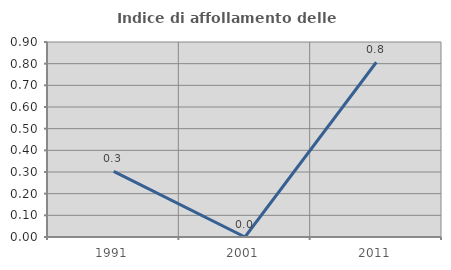
| Category | Indice di affollamento delle abitazioni  |
|---|---|
| 1991.0 | 0.303 |
| 2001.0 | 0 |
| 2011.0 | 0.806 |